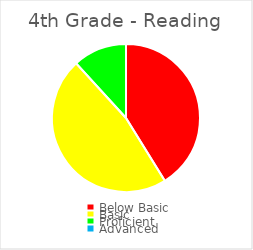
| Category | Series 0 |
|---|---|
| Below Basic | 0.412 |
| Basic | 0.471 |
| Proficient | 0.118 |
| Advanced | 0 |